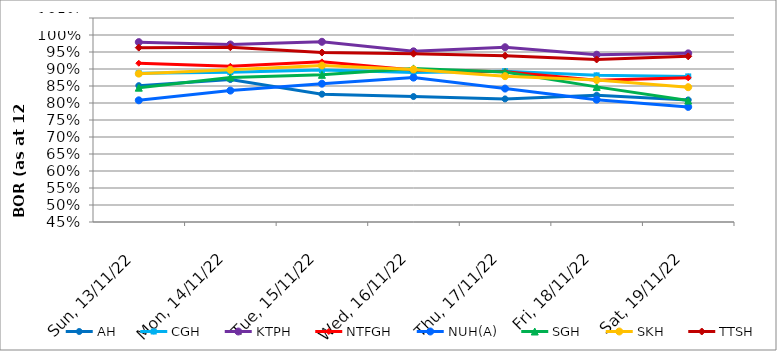
| Category | AH | CGH | KTPH | NTFGH | NUH(A) | SGH | SKH | TTSH |
|---|---|---|---|---|---|---|---|---|
| 2022-11-13 | 0.851 | 0.888 | 0.979 | 0.917 | 0.808 | 0.845 | 0.886 | 0.963 |
| 2022-11-14 | 0.869 | 0.891 | 0.972 | 0.908 | 0.837 | 0.875 | 0.898 | 0.964 |
| 2022-11-15 | 0.826 | 0.897 | 0.98 | 0.921 | 0.857 | 0.883 | 0.91 | 0.948 |
| 2022-11-16 | 0.819 | 0.89 | 0.952 | 0.897 | 0.875 | 0.902 | 0.899 | 0.945 |
| 2022-11-17 | 0.812 | 0.894 | 0.964 | 0.892 | 0.842 | 0.891 | 0.879 | 0.939 |
| 2022-11-18 | 0.823 | 0.881 | 0.942 | 0.867 | 0.81 | 0.847 | 0.868 | 0.928 |
| 2022-11-19 | 0.809 | 0.878 | 0.946 | 0.874 | 0.789 | 0.807 | 0.846 | 0.937 |